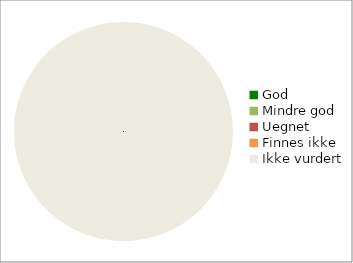
| Category | Series 0 |
|---|---|
| God | 0 |
| Mindre god | 0 |
| Uegnet | 0 |
| Finnes ikke | 0 |
| Ikke vurdert | 96 |